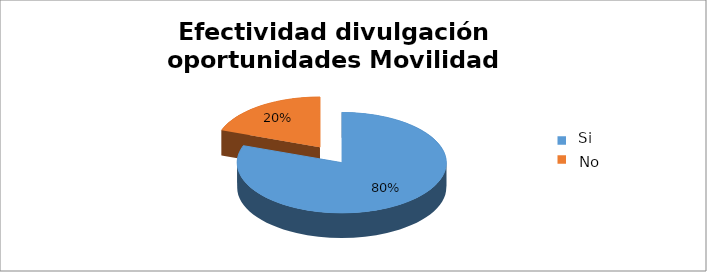
| Category | Series 0 |
|---|---|
| 0 | 0.805 |
| 1 | 0.195 |